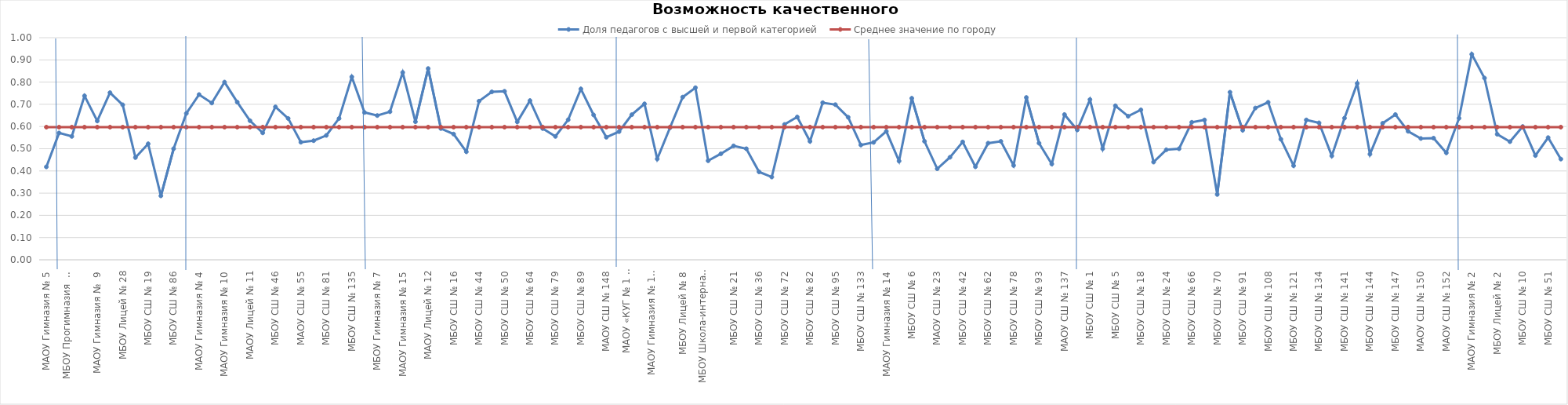
| Category | Доля педагогов с высшей и первой категорией | Среднее значение по городу |
|---|---|---|
| МАОУ Гимназия № 5 | 0.418 | 0.597 |
| ЖЕЛЕЗНОДОРОЖНЫЙ РАЙОН | 0.571 | 0.597 |
| МБОУ Прогимназия  № 131 | 0.556 | 0.597 |
| МБОУ Гимназия № 8 | 0.738 | 0.597 |
| МАОУ Гимназия №  9 | 0.625 | 0.597 |
| МАОУ Лицей № 7 | 0.752 | 0.597 |
| МБОУ Лицей № 28 | 0.698 | 0.597 |
| МБОУ СШ  № 12 | 0.46 | 0.597 |
| МБОУ СШ № 19 | 0.522 | 0.597 |
| МАОУ СШ № 32 | 0.288 | 0.597 |
| МБОУ СШ № 86 | 0.5 | 0.597 |
| КИРОВСКИЙ РАЙОН | 0.659 | 0.597 |
| МАОУ Гимназия № 4 | 0.744 | 0.597 |
| МАОУ Гимназия № 6 | 0.706 | 0.597 |
| МАОУ Гимназия № 10 | 0.8 | 0.597 |
| МАОУ Лицей № 6 "Перспектива" | 0.71 | 0.597 |
| МАОУ Лицей № 11 | 0.626 | 0.597 |
| МБОУ СШ № 8 "Созидание" | 0.571 | 0.597 |
| МБОУ СШ № 46 | 0.689 | 0.597 |
| МБОУ СШ № 49 | 0.636 | 0.597 |
| МАОУ СШ № 55 | 0.529 | 0.597 |
| МБОУ СШ № 63 | 0.536 | 0.597 |
| МБОУ СШ № 81 | 0.56 | 0.597 |
| МБОУ СШ № 90 | 0.636 | 0.597 |
| МБОУ СШ № 135 | 0.824 | 0.597 |
| ЛЕНИНСКИЙ РАЙОН | 0.663 | 0.597 |
| МБОУ Гимназия № 7 | 0.649 | 0.597 |
| МАОУ Гимназия № 11 | 0.667 | 0.597 |
| МАОУ Гимназия № 15 | 0.843 | 0.597 |
| МБОУ Лицей № 3 | 0.622 | 0.597 |
| МАОУ Лицей № 12 | 0.861 | 0.597 |
| МБОУ СШ № 13 | 0.591 | 0.597 |
| МБОУ СШ № 16 | 0.566 | 0.597 |
| МБОУ СШ № 31 | 0.486 | 0.597 |
| МБОУ СШ № 44 | 0.714 | 0.597 |
| МБОУ СШ № 47 | 0.756 | 0.597 |
| МБОУ СШ № 50 | 0.759 | 0.597 |
| МБОУ СШ № 53 | 0.621 | 0.597 |
| МБОУ СШ № 64 | 0.717 | 0.597 |
| МБОУ СШ № 65 | 0.591 | 0.597 |
| МБОУ СШ № 79 | 0.556 | 0.597 |
| МБОУ СШ № 88 | 0.63 | 0.597 |
| МБОУ СШ № 89 | 0.769 | 0.597 |
| МБОУ СШ № 94 | 0.652 | 0.597 |
| МАОУ СШ № 148 | 0.552 | 0.597 |
| ОКТЯБРЬСКИЙ РАЙОН | 0.577 | 0.597 |
| МАОУ «КУГ № 1 – Универс» | 0.653 | 0.597 |
| МАОУ Гимназия № 3 | 0.702 | 0.597 |
| МАОУ Гимназия № 13 "Академ" | 0.454 | 0.597 |
| МАОУ Лицей № 1 | 0.594 | 0.597 |
| МБОУ Лицей № 8 | 0.732 | 0.597 |
| МБОУ Лицей № 10 | 0.775 | 0.597 |
| МБОУ Школа-интернат № 1 | 0.446 | 0.597 |
| МБОУ СШ № 3 | 0.477 | 0.597 |
| МБОУ СШ № 21 | 0.513 | 0.597 |
| МБОУ СШ № 30 | 0.5 | 0.597 |
| МБОУ СШ № 36 | 0.396 | 0.597 |
| МБОУ СШ № 39 | 0.373 | 0.597 |
| МБОУ СШ № 72 | 0.609 | 0.597 |
| МБОУ СШ № 73 | 0.643 | 0.597 |
| МБОУ СШ № 82 | 0.533 | 0.597 |
| МБОУ СШ № 84 | 0.707 | 0.597 |
| МБОУ СШ № 95 | 0.698 | 0.597 |
| МБОУ СШ № 99 | 0.642 | 0.597 |
| МБОУ СШ № 133 | 0.517 | 0.597 |
| СВЕРДЛОВСКИЙ РАЙОН | 0.529 | 0.597 |
| МАОУ Гимназия № 14 | 0.578 | 0.597 |
| МАОУ Лицей № 9 "Лидер" | 0.444 | 0.597 |
| МБОУ СШ № 6 | 0.727 | 0.597 |
| МБОУ СШ № 17 | 0.533 | 0.597 |
| МАОУ СШ № 23 | 0.41 | 0.597 |
| МБОУ СШ № 34 | 0.462 | 0.597 |
| МБОУ СШ № 42 | 0.531 | 0.597 |
| МБОУ СШ № 45 | 0.419 | 0.597 |
| МБОУ СШ № 62 | 0.525 | 0.597 |
| МБОУ СШ № 76 | 0.533 | 0.597 |
| МБОУ СШ № 78 | 0.425 | 0.597 |
| МБОУ СШ № 92 | 0.731 | 0.597 |
| МБОУ СШ № 93 | 0.525 | 0.597 |
| МБОУ СШ № 97 | 0.431 | 0.597 |
| МАОУ СШ № 137 | 0.654 | 0.597 |
| СОВЕТСКИЙ РАЙОН | 0.585 | 0.597 |
| МБОУ СШ № 1 | 0.721 | 0.597 |
| МБОУ СШ № 2 | 0.5 | 0.597 |
| МБОУ СШ № 5 | 0.693 | 0.597 |
| МБОУ СШ № 7 | 0.646 | 0.597 |
| МБОУ СШ № 18 | 0.675 | 0.597 |
| МАОУ СШ № 22 | 0.44 | 0.597 |
| МБОУ СШ № 24 | 0.495 | 0.597 |
| МБОУ СШ № 56 | 0.5 | 0.597 |
| МБОУ СШ № 66 | 0.619 | 0.597 |
| МБОУ СШ № 69 | 0.63 | 0.597 |
| МБОУ СШ № 70 | 0.294 | 0.597 |
| МБОУ СШ № 85 | 0.754 | 0.597 |
| МБОУ СШ № 91 | 0.583 | 0.597 |
| МБОУ СШ № 98 | 0.683 | 0.597 |
| МБОУ СШ № 108 | 0.709 | 0.597 |
| МБОУ СШ № 115 | 0.543 | 0.597 |
| МБОУ СШ № 121 | 0.424 | 0.597 |
| МБОУ СШ № 129 | 0.63 | 0.597 |
| МБОУ СШ № 134 | 0.616 | 0.597 |
| МБОУ СШ № 139 | 0.468 | 0.597 |
| МБОУ СШ № 141 | 0.638 | 0.597 |
| МАОУ СШ № 143 | 0.794 | 0.597 |
| МБОУ СШ № 144 | 0.475 | 0.597 |
| МАОУ СШ № 145 | 0.615 | 0.597 |
| МБОУ СШ № 147 | 0.654 | 0.597 |
| МАОУ СШ № 149 | 0.579 | 0.597 |
| МАОУ СШ № 150 | 0.546 | 0.597 |
| МАОУ СШ № 151 | 0.548 | 0.597 |
| МАОУ СШ № 152 | 0.481 | 0.597 |
| ЦЕНТРАЛЬНЫЙ РАЙОН | 0.637 | 0.597 |
| МАОУ Гимназия № 2 | 0.925 | 0.597 |
| МБОУ  Гимназия № 16 | 0.818 | 0.597 |
| МБОУ Лицей № 2 | 0.565 | 0.597 |
| МБОУ СШ № 4 | 0.532 | 0.597 |
| МБОУ СШ № 10 | 0.6 | 0.597 |
| МБОУ СШ № 27 | 0.469 | 0.597 |
| МБОУ СШ № 51 | 0.55 | 0.597 |
| МАОУ СШ № 153 | 0.453 | 0.597 |